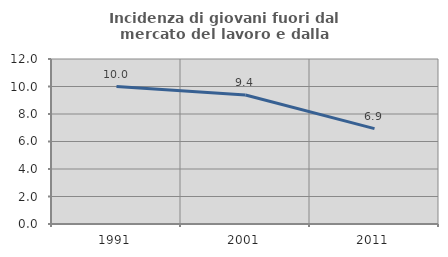
| Category | Incidenza di giovani fuori dal mercato del lavoro e dalla formazione  |
|---|---|
| 1991.0 | 10 |
| 2001.0 | 9.386 |
| 2011.0 | 6.934 |